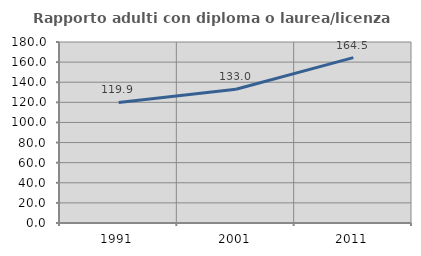
| Category | Rapporto adulti con diploma o laurea/licenza media  |
|---|---|
| 1991.0 | 119.91 |
| 2001.0 | 132.958 |
| 2011.0 | 164.509 |